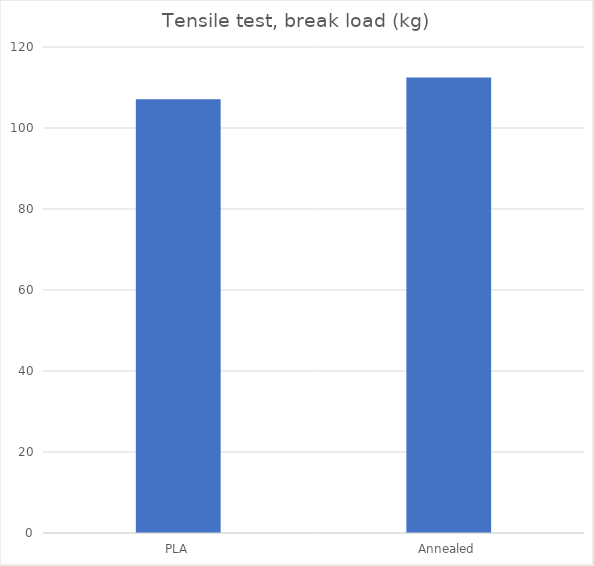
| Category | Average (kg) |
|---|---|
| PLA | 107.1 |
| Annealed | 112.5 |